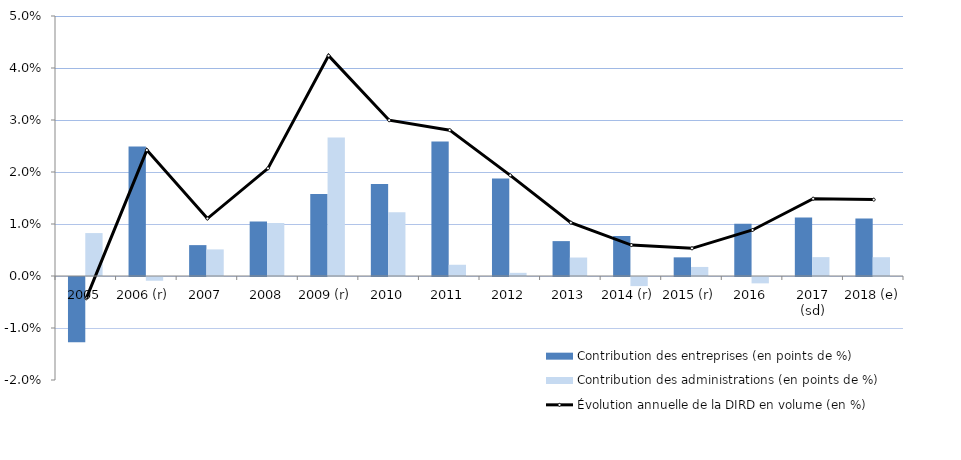
| Category | Contribution des entreprises (en points de %) | Contribution des administrations (en points de %) |
|---|---|---|
| 2005 | -0.013 | 0.008 |
| 2006 (r) | 0.025 | -0.001 |
| 2007 | 0.006 | 0.005 |
| 2008 | 0.011 | 0.01 |
| 2009 (r) | 0.016 | 0.027 |
| 2010 | 0.018 | 0.012 |
| 2011 | 0.026 | 0.002 |
| 2012 | 0.019 | 0.001 |
| 2013 | 0.007 | 0.004 |
| 2014 (r) | 0.008 | -0.002 |
| 2015 (r) | 0.004 | 0.002 |
| 2016 | 0.01 | -0.001 |
| 2017 (sd) | 0.011 | 0.004 |
| 2018 (e) | 0.011 | 0.004 |